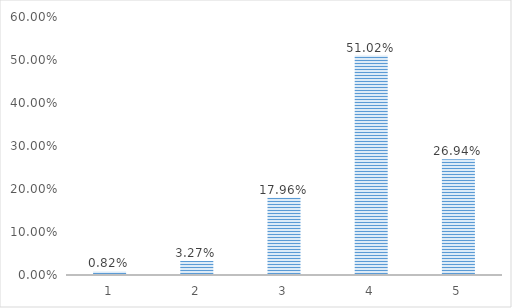
| Category | Series 0 |
|---|---|
| 1.0 | 0.008 |
| 2.0 | 0.033 |
| 3.0 | 0.18 |
| 4.0 | 0.51 |
| 5.0 | 0.269 |